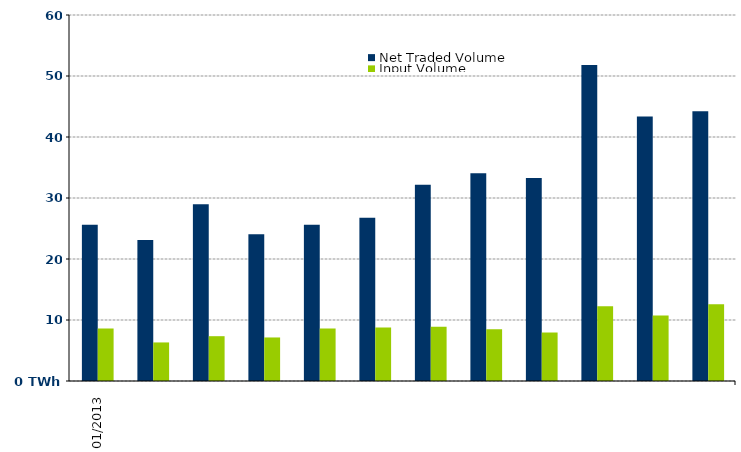
| Category | Net Traded Volume | Input Volume |
|---|---|---|
| 2013-01-01 | 0 | 0 |
| 2013-02-01 | 0 | 0 |